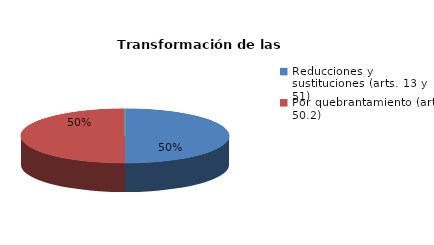
| Category | Series 0 |
|---|---|
| Reducciones y sustituciones (arts. 13 y 51) | 2 |
| Por quebrantamiento (art. 50.2) | 2 |
| Cancelaciones anticipadas | 0 |
| Traslado a Centros Penitenciarios | 0 |
| Conversión internamientos en cerrados (art. 51.2) | 0 |